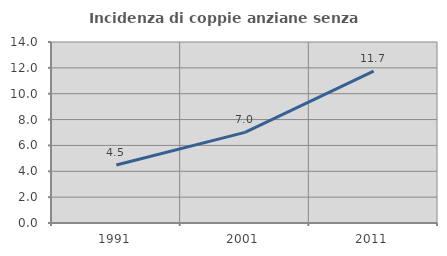
| Category | Incidenza di coppie anziane senza figli  |
|---|---|
| 1991.0 | 4.492 |
| 2001.0 | 7.009 |
| 2011.0 | 11.743 |